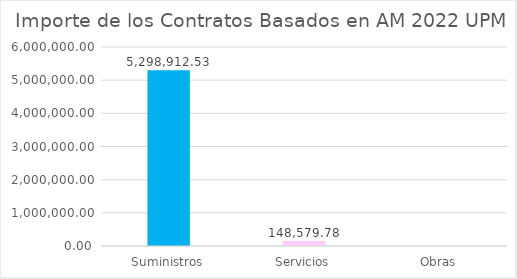
| Category | Series 0 |
|---|---|
| Suministros | 5298912.53 |
| Servicios | 148579.78 |
| Obras | 0 |